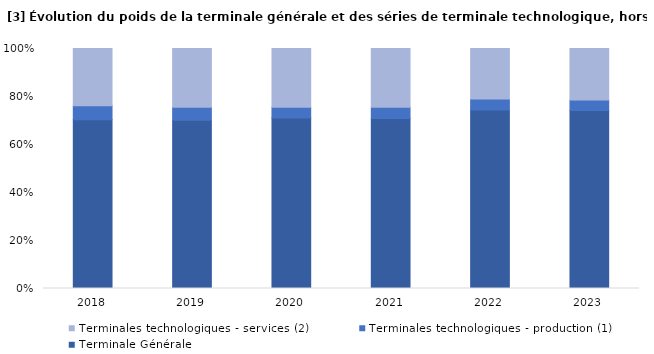
| Category | Terminale Générale | Terminales technologiques - production (1) | Terminales technologiques - services (2) |
|---|---|---|---|
| 2018 | 0.704 | 0.058 | 0.239 |
| 2019 | 0.701 | 0.054 | 0.245 |
| 2020 | 0.71 | 0.045 | 0.245 |
| 2021 | 0.708 | 0.047 | 0.245 |
| 2022 | 0.743 | 0.046 | 0.211 |
| 2023 | 0.742 | 0.044 | 0.215 |